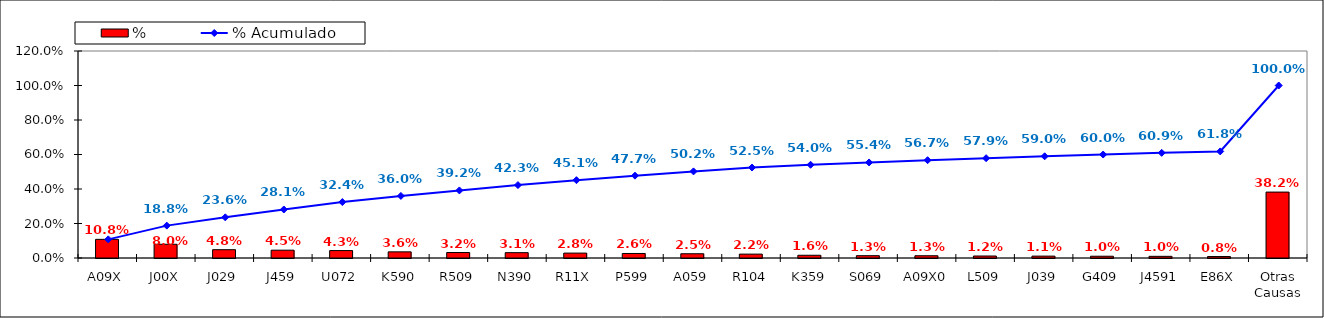
| Category | % |
|---|---|
| A09X | 0.108 |
| J00X | 0.08 |
| J029 | 0.048 |
| J459 | 0.045 |
| U072 | 0.043 |
| K590 | 0.036 |
| R509 | 0.032 |
| N390 | 0.031 |
| R11X | 0.028 |
| P599 | 0.026 |
| A059 | 0.025 |
| R104 | 0.022 |
| K359 | 0.016 |
| S069 | 0.013 |
| A09X0 | 0.013 |
| L509 | 0.012 |
| J039 | 0.011 |
| G409 | 0.01 |
| J4591 | 0.01 |
| E86X | 0.008 |
| Otras Causas | 0.382 |